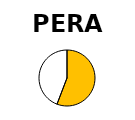
| Category | Series 1 | Series 0 |
|---|---|---|
| Operational Capacity (MW) | 138.88 | 33.996 |
| In progress (MW) | 109.99 | 0 |